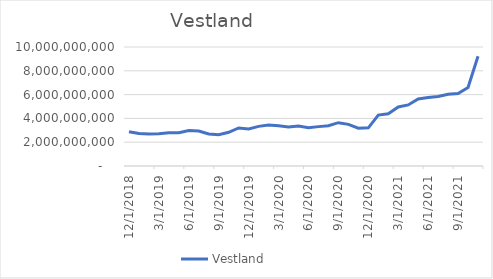
| Category | Vestland |
|---|---|
| 12/1/18 | 2878919166.667 |
| 1/1/19 | 2730246666.667 |
| 2/1/19 | 2679784166.667 |
| 3/1/19 | 2708884166.667 |
| 4/1/19 | 2788049166.667 |
| 5/1/19 | 2788053333.333 |
| 6/1/19 | 2975505083.333 |
| 7/1/19 | 2933507583.333 |
| 8/1/19 | 2688352583.333 |
| 9/1/19 | 2622283416.667 |
| 10/1/19 | 2833550083.333 |
| 11/1/19 | 3197188416.667 |
| 12/1/19 | 3107092583.333 |
| 1/1/20 | 3331076750 |
| 2/1/20 | 3438497583.333 |
| 3/1/20 | 3381210083.333 |
| 4/1/20 | 3282580916.667 |
| 5/1/20 | 3369322583.333 |
| 6/1/20 | 3223344166.667 |
| 7/1/20 | 3309165000 |
| 8/1/20 | 3387365000 |
| 9/1/20 | 3640015000 |
| 10/1/20 | 3501623333.333 |
| 11/1/20 | 3177753333.333 |
| 12/1/20 | 3204914166.667 |
| 1/1/21 | 4282235000 |
| 2/1/21 | 4393272500 |
| 3/1/21 | 4957537500 |
| 4/1/21 | 5132515000 |
| 5/1/21 | 5636256666.667 |
| 6/1/21 | 5760666666.667 |
| 7/1/21 | 5836170833.333 |
| 8/1/21 | 6020866666.667 |
| 9/1/21 | 6091883333.333 |
| 10/1/21 | 6595595833.333 |
| 11/1/21 | 9221098750 |